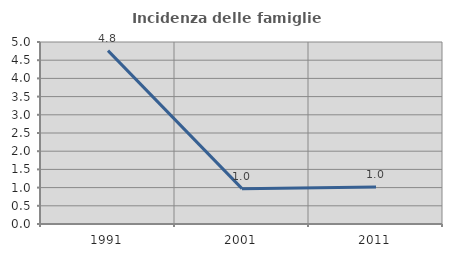
| Category | Incidenza delle famiglie numerose |
|---|---|
| 1991.0 | 4.762 |
| 2001.0 | 0.971 |
| 2011.0 | 1.017 |